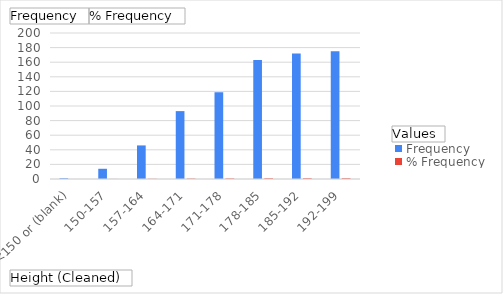
| Category | Frequency | % Frequency |
|---|---|---|
| <150 or (blank) | 1 | 0.006 |
| 150-157 | 14 | 0.08 |
| 157-164 | 46 | 0.263 |
| 164-171 | 93 | 0.531 |
| 171-178 | 119 | 0.68 |
| 178-185 | 163 | 0.931 |
| 185-192 | 172 | 0.983 |
| 192-199 | 175 | 1 |